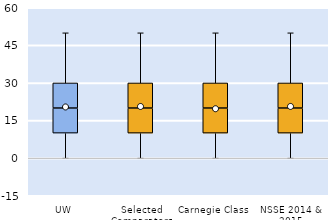
| Category | 25th | 50th | 75th |
|---|---|---|---|
| UW | 10 | 10 | 10 |
| Selected Comparators | 10 | 10 | 10 |
| Carnegie Class | 10 | 10 | 10 |
| NSSE 2014 & 2015 | 10 | 10 | 10 |